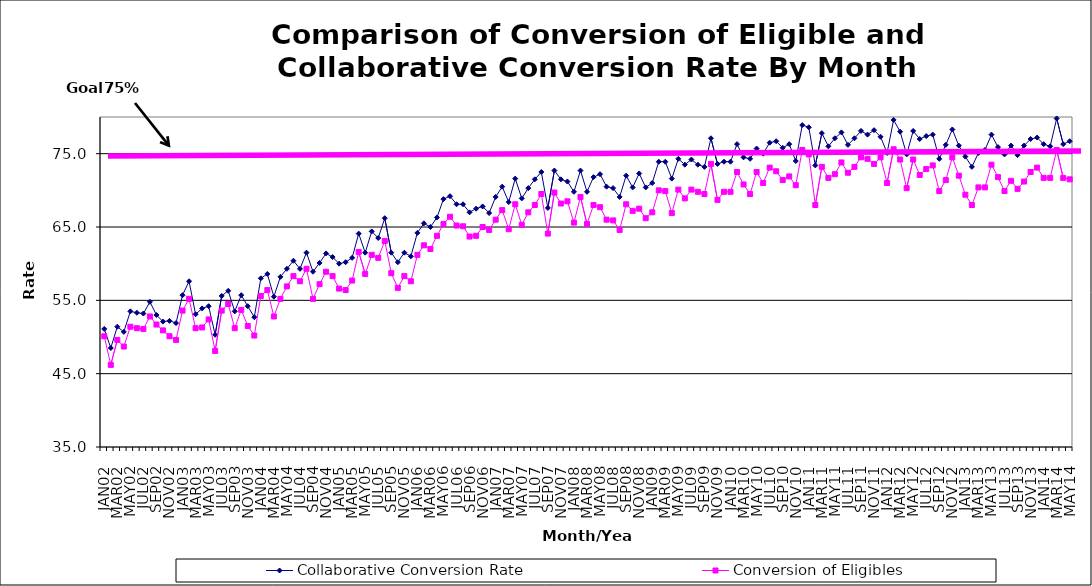
| Category | Collaborative Conversion Rate | Conversion of Eligibles |
|---|---|---|
| JAN02 | 51.1 | 50.1 |
| FEB02 | 48.5 | 46.2 |
| MAR02 | 51.4 | 49.6 |
| APR02 | 50.7 | 48.7 |
| MAY02 | 53.5 | 51.4 |
| JUN02 | 53.3 | 51.2 |
| JUL02 | 53.2 | 51.1 |
| AUG02 | 54.8 | 52.8 |
| SEP02 | 53 | 51.7 |
| OCT02 | 52.1 | 50.9 |
| NOV02 | 52.2 | 50.1 |
| DEC02 | 51.9 | 49.6 |
| JAN03 | 55.7 | 53.6 |
| FEB03 | 57.6 | 55.2 |
| MAR03 | 53.1 | 51.2 |
| APR03 | 53.9 | 51.3 |
| MAY03 | 54.2 | 52.4 |
| JUN03 | 50.3 | 48.1 |
| JUL03 | 55.6 | 53.6 |
| AUG03 | 56.3 | 54.5 |
| SEP03 | 53.5 | 51.2 |
| OCT03 | 55.7 | 53.7 |
| NOV03 | 54.2 | 51.5 |
| DEC03 | 52.7 | 50.2 |
| JAN04 | 58 | 55.6 |
| FEB04 | 58.6 | 56.4 |
| MAR04 | 55.5 | 52.8 |
| APR04 | 58.2 | 55.2 |
| MAY04 | 59.3 | 56.9 |
| JUN04 | 60.4 | 58.3 |
| JUL04 | 59.3 | 57.6 |
| AUG04 | 61.5 | 59.3 |
| SEP04 | 58.9 | 55.2 |
| OCT04 | 60.1 | 57.2 |
| NOV04 | 61.4 | 58.9 |
| DEC04 | 60.9 | 58.3 |
| JAN05 | 60 | 56.6 |
| FEB05 | 60.2 | 56.4 |
| MAR05 | 60.8 | 57.7 |
| APR05 | 64.1 | 61.6 |
| MAY05 | 61.5 | 58.6 |
| JUN05 | 64.4 | 61.2 |
| JUL05 | 63.5 | 60.8 |
| AUG05 | 66.2 | 63.1 |
| SEP05 | 61.5 | 58.7 |
| OCT05 | 60.2 | 56.7 |
| NOV05 | 61.5 | 58.3 |
| DEC05 | 61 | 57.6 |
| JAN06 | 64.2 | 61.2 |
| FEB06 | 65.5 | 62.5 |
| MAR06 | 65 | 62 |
| APR06 | 66.3 | 63.8 |
| MAY06 | 68.8 | 65.4 |
| JUN06 | 69.2 | 66.4 |
| JUL06 | 68.1 | 65.2 |
| AUG06 | 68.1 | 65.1 |
| SEP06 | 67 | 63.7 |
| OCT06 | 67.5 | 63.8 |
| NOV06 | 67.8 | 65 |
| DEC06 | 66.9 | 64.6 |
| JAN07 | 69.1 | 66 |
| FEB07 | 70.5 | 67.3 |
| MAR07 | 68.4 | 64.7 |
| APR07 | 71.6 | 68.1 |
| MAY07 | 68.9 | 65.3 |
| JUN07 | 70.3 | 67 |
| JUL07 | 71.5 | 68 |
| AUG07 | 72.5 | 69.5 |
| SEP07 | 67.6 | 64.1 |
| OCT07 | 72.7 | 69.7 |
| NOV07 | 71.5 | 68.2 |
| DEC07 | 71.2 | 68.5 |
| JAN08 | 69.8 | 65.6 |
| FEB08 | 72.7 | 69.1 |
| MAR08 | 69.8 | 65.4 |
| APR08 | 71.8 | 68 |
| MAY08 | 72.2 | 67.7 |
| JUN08 | 70.5 | 66 |
| JUL08 | 70.3 | 65.9 |
| AUG08 | 69.1 | 64.6 |
| SEP08 | 72 | 68.1 |
| OCT08 | 70.4 | 67.2 |
| NOV08 | 72.3 | 67.5 |
| DEC08 | 70.4 | 66.2 |
| JAN09 | 71 | 67 |
| FEB09 | 73.9 | 70 |
| MAR09 | 73.9 | 69.9 |
| APR09 | 71.6 | 66.9 |
| MAY09 | 74.3 | 70.1 |
| JUN09 | 73.5 | 68.9 |
| JUL09 | 74.2 | 70.1 |
| AUG09 | 73.5 | 69.8 |
| SEP09 | 73.2 | 69.5 |
| OCT09 | 77.1 | 73.6 |
| NOV09 | 73.6 | 68.7 |
| DEC09 | 73.9 | 69.8 |
| JAN10 | 73.9 | 69.8 |
| FEB10 | 76.3 | 72.5 |
| MAR10 | 74.5 | 70.8 |
| APR10 | 74.3 | 69.5 |
| MAY10 | 75.7 | 72.5 |
| JUN10 | 75 | 71 |
| JUL10 | 76.5 | 73.1 |
| AUG10 | 76.7 | 72.6 |
| SEP10 | 75.8 | 71.4 |
| OCT10 | 76.3 | 71.9 |
| NOV10 | 74 | 70.7 |
| DEC10 | 78.9 | 75.5 |
| JAN11 | 78.6 | 74.9 |
| FEB11 | 73.4 | 68 |
| MAR11 | 77.8 | 73.2 |
| APR11 | 76 | 71.7 |
| MAY11 | 77.1 | 72.2 |
| JUN11 | 77.9 | 73.8 |
| JUL11 | 76.2 | 72.4 |
| AUG11 | 77.1 | 73.2 |
| SEP11 | 78.1 | 74.5 |
| OCT11 | 77.6 | 74.3 |
| NOV11 | 78.2 | 73.6 |
| DEC11 | 77.3 | 74.5 |
| JAN12 | 75.1 | 71 |
| FEB12 | 79.6 | 75.6 |
| MAR12 | 78 | 74.2 |
| APR12 | 74.9 | 70.3 |
| MAY12 | 78.1 | 74.2 |
| JUN12 | 77 | 72.1 |
| JUL12 | 77.4 | 72.9 |
| AUG12 | 77.6 | 73.4 |
| SEP12 | 74.3 | 69.9 |
| OCT12 | 76.2 | 71.4 |
| NOV12 | 78.3 | 74.5 |
| DEC12 | 76.1 | 72 |
| JAN13 | 74.6 | 69.4 |
| FEB13 | 73.2 | 68 |
| MAR13 | 75.1 | 70.4 |
| APR13 | 75.5 | 70.4 |
| MAY13 | 77.6 | 73.5 |
| JUN13 | 75.9 | 71.8 |
| JUL13 | 74.9 | 69.9 |
| AUG13 | 76.1 | 71.3 |
| SEP13 | 74.8 | 70.2 |
| OCT13 | 76.1 | 71.2 |
| NOV13 | 77 | 72.5 |
| DEC13 | 77.2 | 73.1 |
| JAN14 | 76.3 | 71.7 |
| FEB14 | 76 | 71.7 |
| MAR14 | 79.8 | 75.5 |
| APR14 | 76.3 | 71.7 |
| MAY14 | 76.7 | 71.5 |